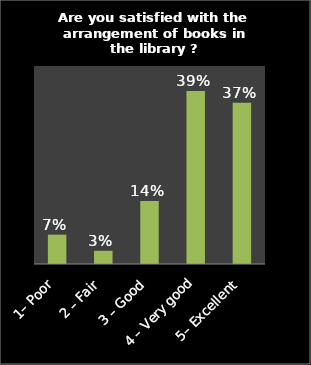
| Category | Series 0 |
|---|---|
| 1– Poor | 0.067 |
| 2 – Fair | 0.03 |
| 3 – Good | 0.143 |
| 4 – Very good | 0.393 |
| 5– Excellent | 0.367 |